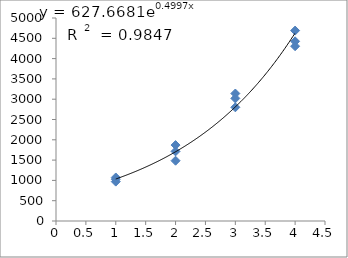
| Category | Series 0 |
|---|---|
| 1.0 | 970 |
| 1.0 | 1072 |
| 1.0 | 1030 |
| 2.0 | 1870 |
| 2.0 | 1715 |
| 2.0 | 1485 |
| 3.0 | 2800 |
| 3.0 | 3020 |
| 3.0 | 3140 |
| 4.0 | 4425 |
| 4.0 | 4690 |
| 4.0 | 4305 |